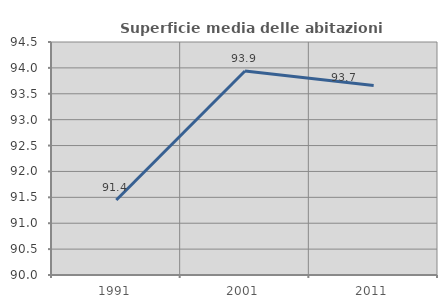
| Category | Superficie media delle abitazioni occupate |
|---|---|
| 1991.0 | 91.449 |
| 2001.0 | 93.94 |
| 2011.0 | 93.662 |